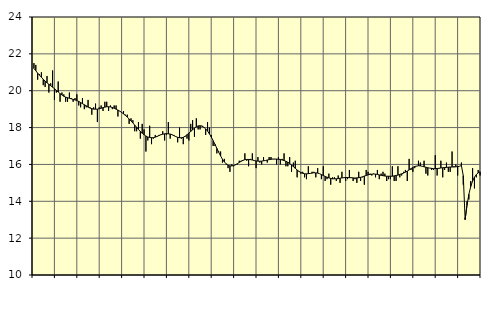
| Category | Tillverkning o utvinning, energi o miljö, SNI 05-33, 35-39 | Series 1 |
|---|---|---|
| nan | 21.5 | 21.2 |
| 1.0 | 21.4 | 21.09 |
| 1.0 | 20.6 | 20.95 |
| 1.0 | 20.9 | 20.84 |
| 1.0 | 21 | 20.73 |
| 1.0 | 20.3 | 20.62 |
| 1.0 | 20.2 | 20.52 |
| 1.0 | 20.8 | 20.43 |
| 1.0 | 19.9 | 20.35 |
| 1.0 | 20.4 | 20.27 |
| 1.0 | 21.1 | 20.19 |
| 1.0 | 19.5 | 20.11 |
| nan | 19.9 | 20.02 |
| 2.0 | 20.5 | 19.93 |
| 2.0 | 19.4 | 19.84 |
| 2.0 | 19.9 | 19.77 |
| 2.0 | 19.8 | 19.7 |
| 2.0 | 19.4 | 19.65 |
| 2.0 | 19.4 | 19.62 |
| 2.0 | 19.9 | 19.59 |
| 2.0 | 19.6 | 19.56 |
| 2.0 | 19.4 | 19.53 |
| 2.0 | 19.6 | 19.5 |
| 2.0 | 19.8 | 19.46 |
| nan | 19.2 | 19.42 |
| 3.0 | 19.1 | 19.36 |
| 3.0 | 19.6 | 19.3 |
| 3.0 | 19 | 19.24 |
| 3.0 | 19.1 | 19.18 |
| 3.0 | 19.5 | 19.11 |
| 3.0 | 19.1 | 19.06 |
| 3.0 | 18.7 | 19.03 |
| 3.0 | 19.1 | 19 |
| 3.0 | 19.3 | 19 |
| 3.0 | 18.3 | 19 |
| 3.0 | 19.1 | 19.02 |
| nan | 19.2 | 19.05 |
| 4.0 | 18.9 | 19.08 |
| 4.0 | 19.4 | 19.11 |
| 4.0 | 19.4 | 19.13 |
| 4.0 | 18.9 | 19.13 |
| 4.0 | 19.2 | 19.12 |
| 4.0 | 19 | 19.09 |
| 4.0 | 19.2 | 19.05 |
| 4.0 | 19.2 | 19 |
| 4.0 | 18.6 | 18.95 |
| 4.0 | 18.9 | 18.89 |
| 4.0 | 18.8 | 18.82 |
| nan | 18.9 | 18.74 |
| 5.0 | 18.7 | 18.66 |
| 5.0 | 18.7 | 18.57 |
| 5.0 | 18.2 | 18.47 |
| 5.0 | 18.5 | 18.36 |
| 5.0 | 18.4 | 18.25 |
| 5.0 | 17.8 | 18.13 |
| 5.0 | 17.8 | 18.02 |
| 5.0 | 18.3 | 17.9 |
| 5.0 | 17.4 | 17.79 |
| 5.0 | 18.2 | 17.69 |
| 5.0 | 17.9 | 17.61 |
| nan | 16.7 | 17.54 |
| 6.0 | 17.3 | 17.49 |
| 6.0 | 18.1 | 17.46 |
| 6.0 | 17.1 | 17.45 |
| 6.0 | 17.4 | 17.45 |
| 6.0 | 17.6 | 17.48 |
| 6.0 | 17.5 | 17.52 |
| 6.0 | 17.6 | 17.57 |
| 6.0 | 17.6 | 17.61 |
| 6.0 | 17.8 | 17.64 |
| 6.0 | 17.3 | 17.66 |
| 6.0 | 17.6 | 17.67 |
| nan | 18.3 | 17.66 |
| 7.0 | 17.4 | 17.65 |
| 7.0 | 17.6 | 17.61 |
| 7.0 | 17.6 | 17.56 |
| 7.0 | 17.5 | 17.51 |
| 7.0 | 17.2 | 17.47 |
| 7.0 | 18 | 17.45 |
| 7.0 | 17.4 | 17.45 |
| 7.0 | 17.1 | 17.47 |
| 7.0 | 17.5 | 17.53 |
| 7.0 | 17.4 | 17.61 |
| 7.0 | 17.3 | 17.7 |
| nan | 18.2 | 17.79 |
| 8.0 | 18.4 | 17.88 |
| 8.0 | 17.5 | 17.97 |
| 8.0 | 18.5 | 18.04 |
| 8.0 | 17.9 | 18.09 |
| 8.0 | 17.9 | 18.1 |
| 8.0 | 18.1 | 18.08 |
| 8.0 | 18 | 18.02 |
| 8.0 | 17.6 | 17.93 |
| 8.0 | 18.3 | 17.81 |
| 8.0 | 18 | 17.66 |
| 8.0 | 17.6 | 17.49 |
| nan | 17 | 17.29 |
| 9.0 | 17 | 17.09 |
| 9.0 | 16.6 | 16.87 |
| 9.0 | 16.7 | 16.66 |
| 9.0 | 16.7 | 16.46 |
| 9.0 | 16.1 | 16.28 |
| 9.0 | 16.3 | 16.14 |
| 9.0 | 16 | 16.03 |
| 9.0 | 15.8 | 15.96 |
| 9.0 | 15.6 | 15.92 |
| 9.0 | 16 | 15.92 |
| 9.0 | 15.9 | 15.94 |
| nan | 16 | 15.98 |
| 10.0 | 16 | 16.04 |
| 10.0 | 16.2 | 16.11 |
| 10.0 | 16.2 | 16.17 |
| 10.0 | 16.2 | 16.22 |
| 10.0 | 16.6 | 16.26 |
| 10.0 | 16.2 | 16.27 |
| 10.0 | 15.9 | 16.27 |
| 10.0 | 16.3 | 16.26 |
| 10.0 | 16.6 | 16.24 |
| 10.0 | 16.2 | 16.21 |
| 10.0 | 15.8 | 16.19 |
| nan | 16.4 | 16.18 |
| 11.0 | 16.1 | 16.17 |
| 11.0 | 16 | 16.18 |
| 11.0 | 16.4 | 16.2 |
| 11.0 | 16.2 | 16.21 |
| 11.0 | 16.1 | 16.24 |
| 11.0 | 16.4 | 16.26 |
| 11.0 | 16.4 | 16.28 |
| 11.0 | 16.3 | 16.29 |
| 11.0 | 16.3 | 16.29 |
| 11.0 | 16 | 16.29 |
| 11.0 | 16.4 | 16.28 |
| nan | 16 | 16.27 |
| 12.0 | 16.3 | 16.24 |
| 12.0 | 16.6 | 16.21 |
| 12.0 | 15.9 | 16.17 |
| 12.0 | 15.9 | 16.12 |
| 12.0 | 16.4 | 16.05 |
| 12.0 | 15.6 | 15.97 |
| 12.0 | 16.1 | 15.88 |
| 12.0 | 16.2 | 15.79 |
| 12.0 | 15.3 | 15.7 |
| 12.0 | 15.6 | 15.62 |
| 12.0 | 15.5 | 15.56 |
| nan | 15.6 | 15.52 |
| 13.0 | 15.3 | 15.49 |
| 13.0 | 15.2 | 15.49 |
| 13.0 | 15.9 | 15.5 |
| 13.0 | 15.5 | 15.51 |
| 13.0 | 15.6 | 15.53 |
| 13.0 | 15.6 | 15.55 |
| 13.0 | 15.3 | 15.54 |
| 13.0 | 15.8 | 15.53 |
| 13.0 | 15.5 | 15.5 |
| 13.0 | 15.2 | 15.45 |
| 13.0 | 15.9 | 15.4 |
| nan | 15.1 | 15.35 |
| 14.0 | 15.2 | 15.31 |
| 14.0 | 15.5 | 15.27 |
| 14.0 | 14.9 | 15.24 |
| 14.0 | 15.3 | 15.22 |
| 14.0 | 15.3 | 15.22 |
| 14.0 | 15.1 | 15.22 |
| 14.0 | 15.4 | 15.23 |
| 14.0 | 15 | 15.25 |
| 14.0 | 15.6 | 15.27 |
| 14.0 | 15.3 | 15.28 |
| 14.0 | 15.1 | 15.29 |
| nan | 15.2 | 15.29 |
| 15.0 | 15.7 | 15.28 |
| 15.0 | 15.3 | 15.28 |
| 15.0 | 15.1 | 15.27 |
| 15.0 | 15.2 | 15.26 |
| 15.0 | 15 | 15.27 |
| 15.0 | 15.6 | 15.28 |
| 15.0 | 15.1 | 15.3 |
| 15.0 | 15.3 | 15.33 |
| 15.0 | 14.9 | 15.37 |
| 15.0 | 15.7 | 15.4 |
| 15.0 | 15.6 | 15.43 |
| nan | 15.5 | 15.46 |
| 16.0 | 15.4 | 15.47 |
| 16.0 | 15.5 | 15.48 |
| 16.0 | 15.3 | 15.47 |
| 16.0 | 15.7 | 15.46 |
| 16.0 | 15.2 | 15.43 |
| 16.0 | 15.5 | 15.41 |
| 16.0 | 15.6 | 15.39 |
| 16.0 | 15.5 | 15.37 |
| 16.0 | 15.1 | 15.36 |
| 16.0 | 15.2 | 15.36 |
| 16.0 | 15.2 | 15.36 |
| nan | 15.9 | 15.36 |
| 17.0 | 15.1 | 15.38 |
| 17.0 | 15.1 | 15.4 |
| 17.0 | 15.9 | 15.42 |
| 17.0 | 15.3 | 15.46 |
| 17.0 | 15.4 | 15.49 |
| 17.0 | 15.6 | 15.53 |
| 17.0 | 15.7 | 15.58 |
| 17.0 | 15.1 | 15.64 |
| 17.0 | 16.3 | 15.7 |
| 17.0 | 15.7 | 15.77 |
| 17.0 | 15.6 | 15.84 |
| nan | 15.8 | 15.89 |
| 18.0 | 15.9 | 15.91 |
| 18.0 | 16.2 | 15.93 |
| 18.0 | 16.1 | 15.92 |
| 18.0 | 15.9 | 15.9 |
| 18.0 | 16.2 | 15.87 |
| 18.0 | 15.5 | 15.85 |
| 18.0 | 15.4 | 15.82 |
| 18.0 | 15.8 | 15.8 |
| 18.0 | 15.7 | 15.79 |
| 18.0 | 15.7 | 15.77 |
| 18.0 | 16.5 | 15.77 |
| nan | 15.4 | 15.78 |
| 19.0 | 15.8 | 15.79 |
| 19.0 | 16.2 | 15.81 |
| 19.0 | 15.3 | 15.82 |
| 19.0 | 15.7 | 15.83 |
| 19.0 | 16.1 | 15.84 |
| 19.0 | 15.6 | 15.85 |
| 19.0 | 15.6 | 15.86 |
| 19.0 | 16.7 | 15.86 |
| 19.0 | 15.9 | 15.86 |
| 19.0 | 16 | 15.87 |
| 19.0 | 15.4 | 15.88 |
| nan | 15.9 | 15.9 |
| 20.0 | 16.1 | 15.94 |
| 20.0 | 14.9 | 15.39 |
| 20.0 | 13.1 | 13.01 |
| 20.0 | 14 | 13.8 |
| 20.0 | 14.1 | 14.38 |
| 20.0 | 15.1 | 14.8 |
| 20.0 | 15.8 | 15.1 |
| 20.0 | 14.7 | 15.31 |
| 20.0 | 15.3 | 15.45 |
| 20.0 | 15.7 | 15.54 |
| 20.0 | 15.4 | 15.6 |